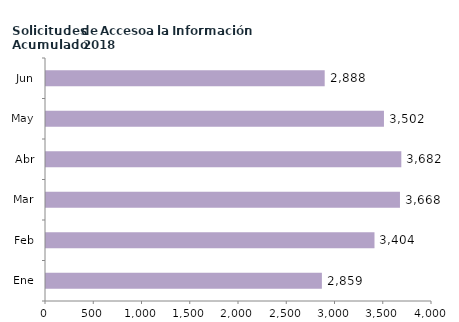
| Category | Series 0 |
|---|---|
| Ene | 2859 |
| Feb | 3404 |
| Mar | 3668 |
| Abr | 3682 |
| May | 3502 |
| Jun | 2888 |